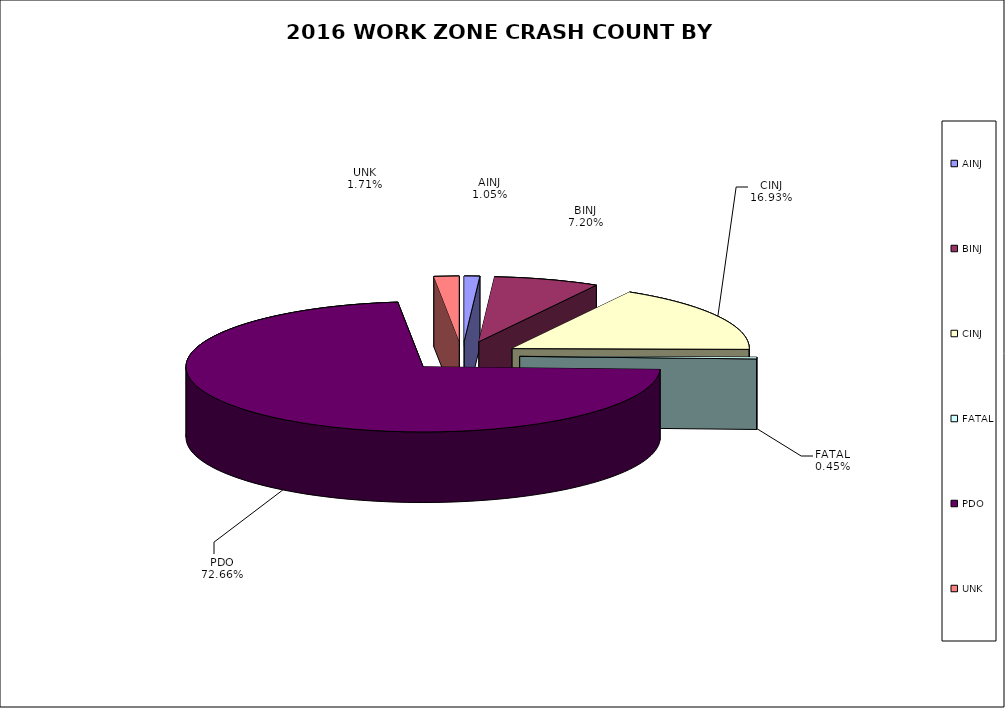
| Category | Series 0 | Series 1 |
|---|---|---|
| AINJ | 66 | 0.011 |
| BINJ | 451 | 0.072 |
| CINJ | 1061 | 0.169 |
| FATAL | 28 | 0.004 |
| PDO | 4553 | 0.727 |
| UNK | 107 | 0.017 |